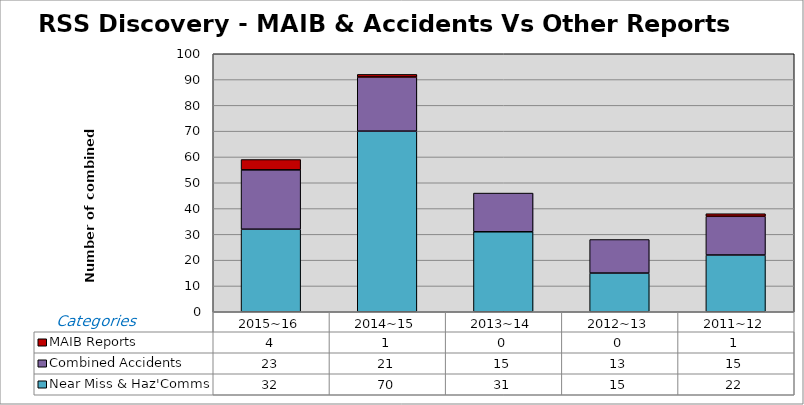
| Category | Near Miss & Haz'Comms | Combined Accidents | MAIB Reports |
|---|---|---|---|
| 2015~16 | 32 | 23 | 4 |
| 2014~15 | 70 | 21 | 1 |
| 2013~14 | 31 | 15 | 0 |
| 2012~13 | 15 | 13 | 0 |
| 2011~12 | 22 | 15 | 1 |